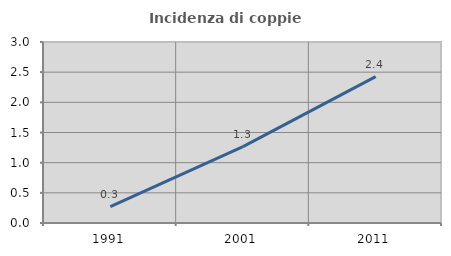
| Category | Incidenza di coppie miste |
|---|---|
| 1991.0 | 0.27 |
| 2001.0 | 1.266 |
| 2011.0 | 2.426 |